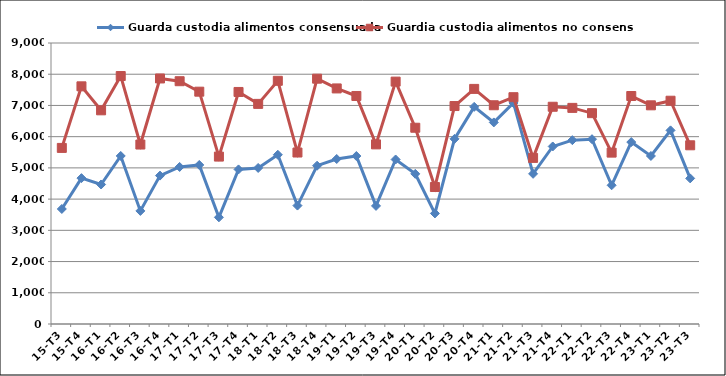
| Category | Guarda custodia alimentos consensuada | Guardia custodia alimentos no consensuada |
|---|---|---|
| 15-T3 | 3684 | 5640 |
| 15-T4 | 4672 | 7612 |
| 16-T1 | 4468 | 6844 |
| 16-T2 | 5382 | 7942 |
| 16-T3 | 3622 | 5748 |
| 16-T4 | 4753 | 7864 |
| 17-T1 | 5030 | 7776 |
| 17-T2 | 5094 | 7441 |
| 17-T3 | 3417 | 5362 |
| 17-T4 | 4951 | 7432 |
| 18-T1 | 4998 | 7050 |
| 18-T2 | 5420 | 7789 |
| 18-T3 | 3793 | 5492 |
| 18-T4 | 5070 | 7857 |
| 19-T1 | 5285 | 7545 |
| 19-T2 | 5380 | 7303 |
| 19-T3 | 3782 | 5753 |
| 19-T4 | 5269 | 7763 |
| 20-T1 | 4809 | 6286 |
| 20-T2 | 3542 | 4387 |
| 20-T3 | 5930 | 6981 |
| 20-T4 | 6955 | 7530 |
| 21-T1 | 6456 | 7006 |
| 21-T2 | 7080 | 7264 |
| 21-T3 | 4810 | 5320 |
| 21-T4 | 5686 | 6958 |
| 22-T1 | 5888 | 6922 |
| 22-T2 | 5919 | 6753 |
| 22-T3 | 4443 | 5489 |
| 22-T4 | 5827 | 7302 |
| 23-T1 | 5382 | 7004 |
| 23-T2 | 6202 | 7151 |
| 23-T3 | 4664 | 5724 |